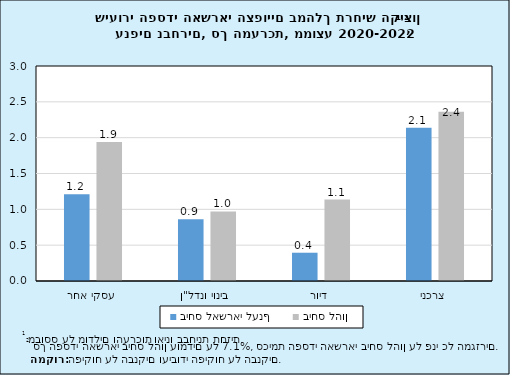
| Category | ביחס לאשראי לענף | ביחס להון |
|---|---|---|
| עסקי אחר | 1.21 | 1.939 |
| בינוי ונדל"ן | 0.861 | 0.971 |
| דיור | 0.394 | 1.136 |
| צרכני | 2.139 | 2.361 |